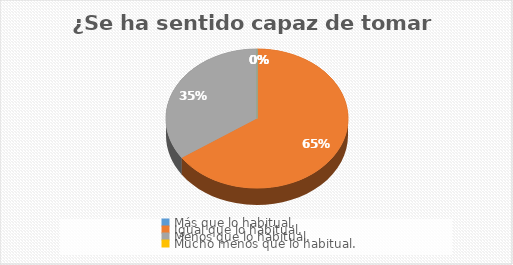
| Category | ¿Se ha sentido capaz de tomar decisiones? |
|---|---|
| Más que lo habitual. | 0 |
| Igual que lo habitual. | 72 |
| Menos que lo habitual. | 38 |
| Mucho menos que lo habitual. | 0 |